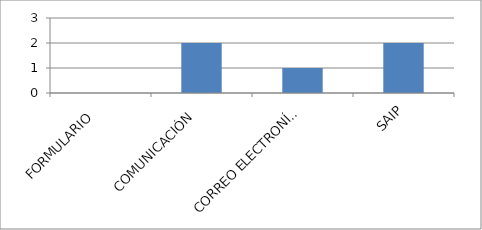
| Category | Series 0 |
|---|---|
| FORMULARIO  | 0 |
| COMUNICACIÓN  | 2 |
| CORREO ELECTRONÍCO  | 1 |
| SAIP | 2 |